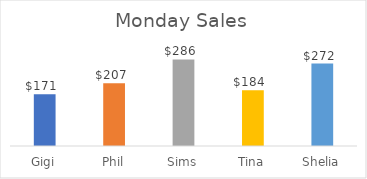
| Category | Sales |
|---|---|
| Gigi | 171 |
| Phil | 207 |
| Sims | 286 |
| Tina | 184 |
| Shelia | 272 |